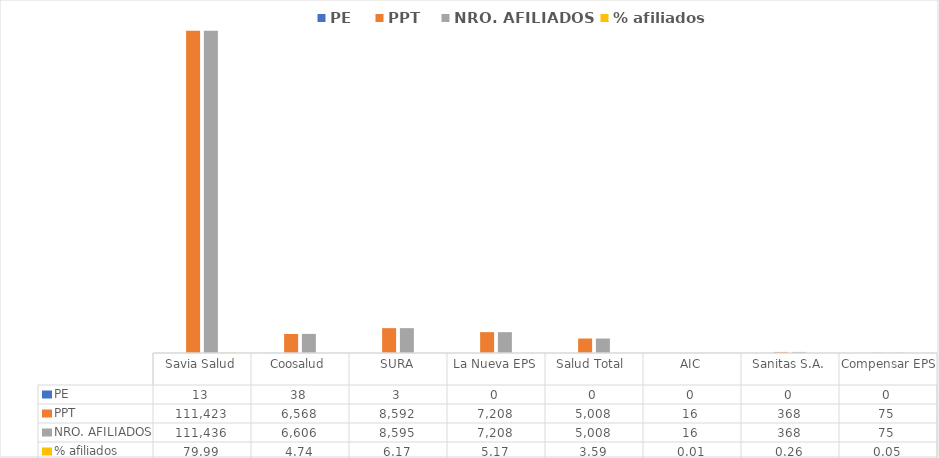
| Category | PE | PPT | NRO. AFILIADOS | % afiliados |
|---|---|---|---|---|
| Savia Salud | 13 | 111423 | 111436 | 79.99 |
| Coosalud | 38 | 6568 | 6606 | 4.742 |
| SURA | 3 | 8592 | 8595 | 6.17 |
| La Nueva EPS | 0 | 7208 | 7208 | 5.174 |
| Salud Total  | 0 | 5008 | 5008 | 3.595 |
| AIC | 0 | 16 | 16 | 0.011 |
| Sanitas S.A. | 0 | 368 | 368 | 0.264 |
| Compensar EPS | 0 | 75 | 75 | 0.054 |